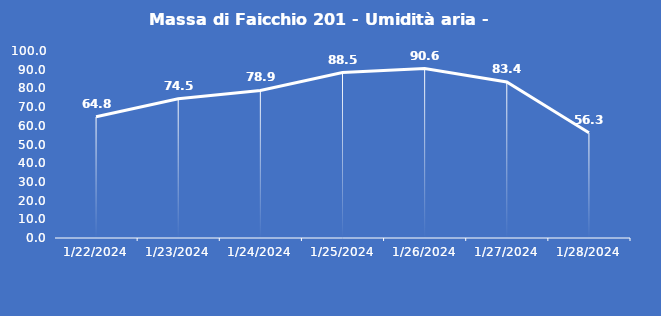
| Category | Massa di Faicchio 201 - Umidità aria - Grezzo (%) |
|---|---|
| 1/22/24 | 64.8 |
| 1/23/24 | 74.5 |
| 1/24/24 | 78.9 |
| 1/25/24 | 88.5 |
| 1/26/24 | 90.6 |
| 1/27/24 | 83.4 |
| 1/28/24 | 56.3 |